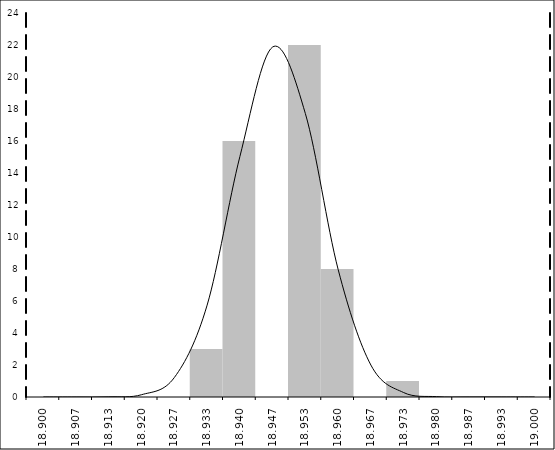
| Category | Series 1 |
|---|---|
| 18.9 | 0 |
| 18.906666666666666 | 0 |
| 18.913333333333334 | 0 |
| 18.92 | 0 |
| 18.92666666666667 | 0 |
| 18.933333333333337 | 3 |
| 18.940000000000005 | 16 |
| 18.946666666666673 | 0 |
| 18.95333333333334 | 22 |
| 18.960000000000008 | 8 |
| 18.966666666666676 | 0 |
| 18.973333333333343 | 1 |
| 18.98000000000001 | 0 |
| 18.98666666666668 | 0 |
| 18.993333333333347 | 0 |
| 19.0 | 0 |